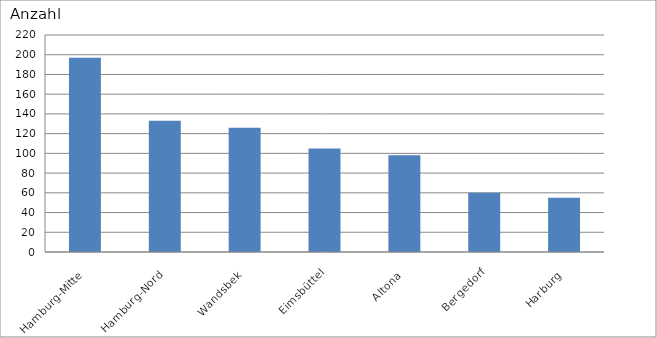
| Category | Hamburg-Mitte Hamburg-Nord Wandsbek Eimsbüttel Altona Bergedorf Harburg |
|---|---|
| Hamburg-Mitte | 197 |
| Hamburg-Nord | 133 |
| Wandsbek | 126 |
| Eimsbüttel | 105 |
| Altona | 98 |
| Bergedorf | 60 |
| Harburg | 55 |